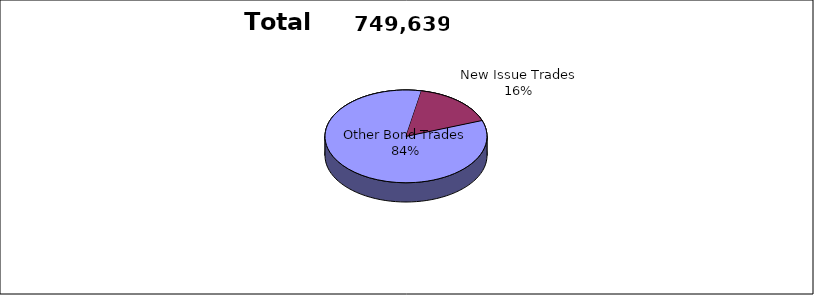
| Category | Series 0 |
|---|---|
| Other Bond Trades | 626758 |
| New Issue Trades | 122881 |